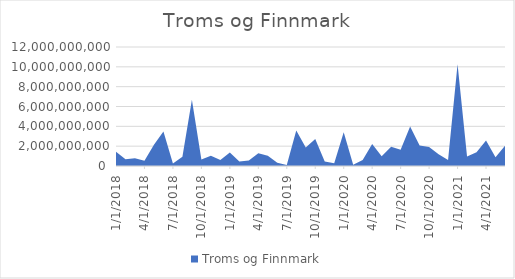
| Category | Troms og Finnmark |
|---|---|
| 1/1/18 | 1426475000 |
| 2/1/18 | 670500000 |
| 3/1/18 | 784700000 |
| 4/1/18 | 537320000 |
| 5/1/18 | 2144610000 |
| 6/1/18 | 3484800000 |
| 7/1/18 | 244550000 |
| 8/1/18 | 922150000 |
| 9/1/18 | 6673850000 |
| 10/1/18 | 644330000 |
| 11/1/18 | 1024250000 |
| 12/1/18 | 595900000 |
| 1/1/19 | 1357080000 |
| 2/1/19 | 445400000 |
| 3/1/19 | 549650000 |
| 4/1/19 | 1297380000 |
| 5/1/19 | 1044350000 |
| 6/1/19 | 326950000 |
| 7/1/19 | 95300000 |
| 8/1/19 | 3581250000 |
| 9/1/19 | 1870500000 |
| 10/1/19 | 2717950000 |
| 11/1/19 | 442200000 |
| 12/1/19 | 265000000 |
| 1/1/20 | 3402750000 |
| 2/1/20 | 131200000 |
| 3/1/20 | 594540000 |
| 4/1/20 | 2230750000 |
| 5/1/20 | 981900000 |
| 6/1/20 | 1935600000 |
| 7/1/20 | 1643005000 |
| 8/1/20 | 3995594000 |
| 9/1/20 | 2078000000 |
| 10/1/20 | 1927200000 |
| 11/1/20 | 1175800000 |
| 12/1/20 | 606700000 |
| 1/1/21 | 10254100000 |
| 2/1/21 | 949900000 |
| 3/1/21 | 1398350000 |
| 4/1/21 | 2582020000 |
| 5/1/21 | 877700000 |
| 6/1/21 | 2038150000 |